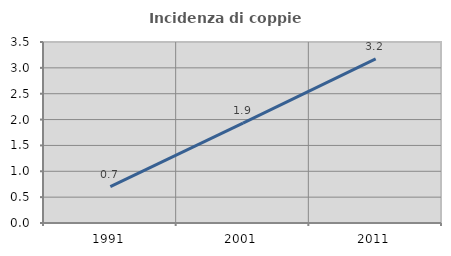
| Category | Incidenza di coppie miste |
|---|---|
| 1991.0 | 0.702 |
| 2001.0 | 1.931 |
| 2011.0 | 3.173 |